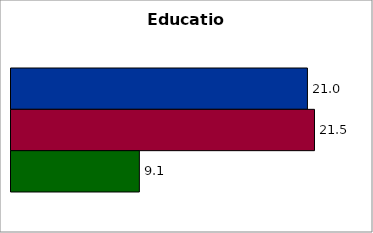
| Category | 50 states and D.C. | SREB states | State |
|---|---|---|---|
| 0 | 20.994 | 21.494 | 9.091 |